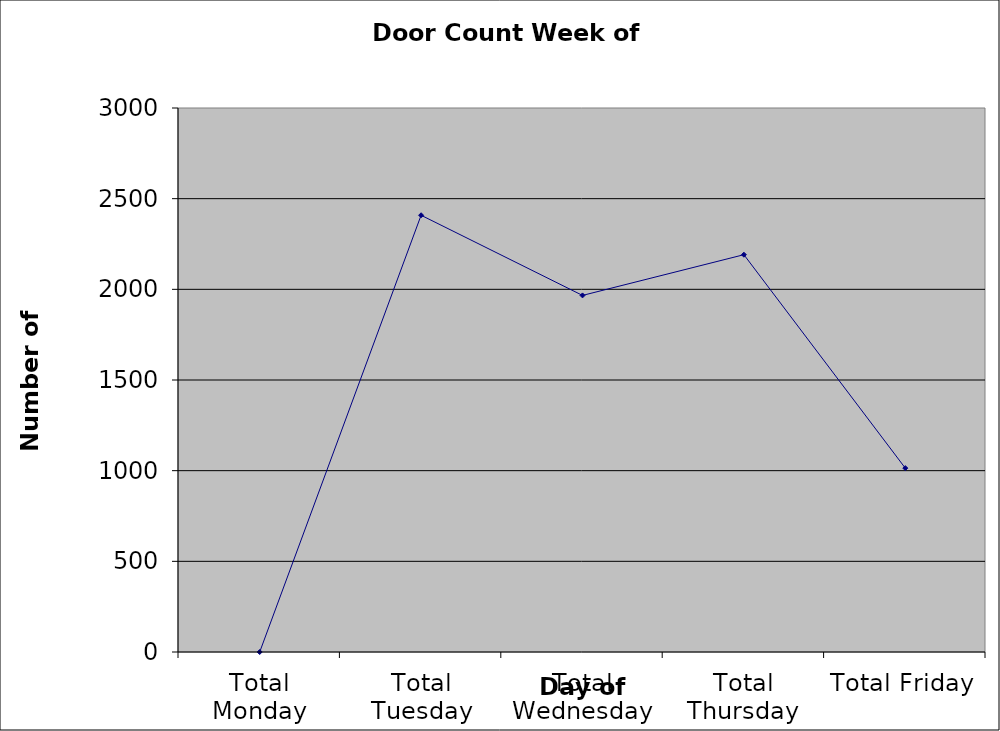
| Category | Series 0 |
|---|---|
| Total Monday | 0 |
| Total Tuesday | 2408.5 |
| Total Wednesday | 1966.5 |
| Total Thursday | 2191 |
| Total Friday | 1014 |